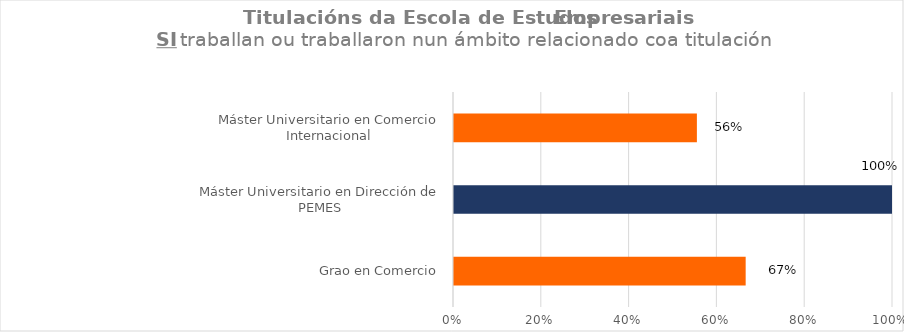
| Category | Series 1 |
|---|---|
| Grao en Comercio | 0.667 |
| Máster Universitario en Dirección de PEMES | 1 |
| Máster Universitario en Comercio Internacional | 0.556 |